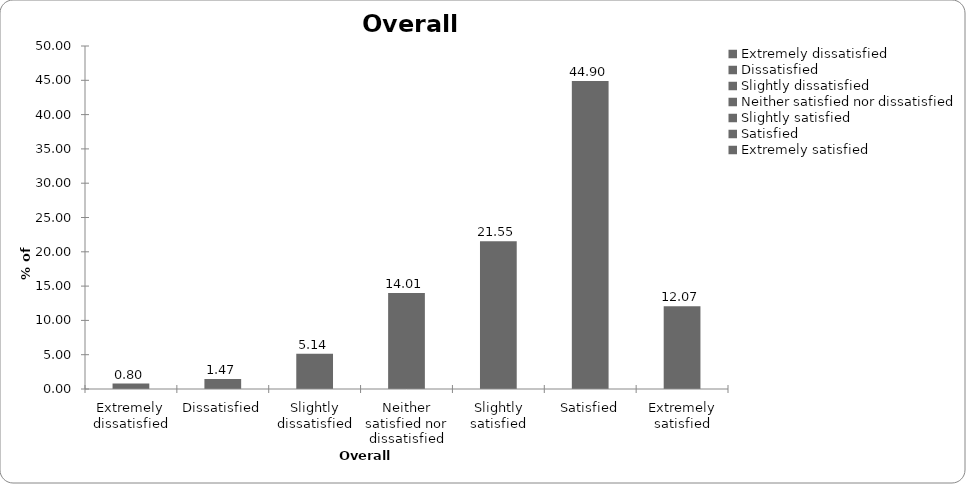
| Category | Overall satisfaction |
|---|---|
| Extremely dissatisfied | 0.801 |
| Dissatisfied | 1.468 |
| Slightly dissatisfied | 5.137 |
| Neither satisfied nor dissatisfied | 14.009 |
| Slightly satisfied | 21.548 |
| Satisfied | 44.897 |
| Extremely satisfied | 12.075 |